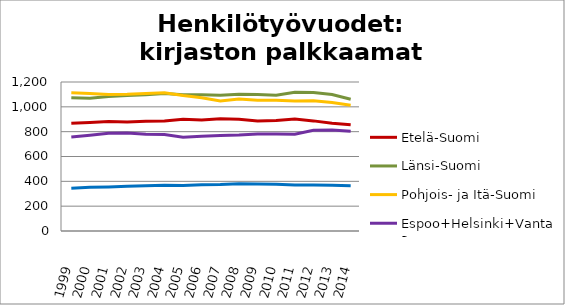
| Category | Etelä-Suomi | Länsi-Suomi | Pohjois- ja Itä-Suomi | Espoo+Helsinki+Vantaa | Muu Uusimaa |
|---|---|---|---|---|---|
| 1999.0 | 867.8 | 1074 | 1113.2 | 757.1 | 344.4 |
| 2000.0 | 874.6 | 1069.6 | 1108 | 771 | 351.6 |
| 2001.0 | 880.97 | 1082.95 | 1098.57 | 787 | 355.25 |
| 2002.0 | 877.57 | 1090.52 | 1100.49 | 789 | 359.84 |
| 2003.0 | 884.19 | 1096.31 | 1107.21 | 778.32 | 363.54 |
| 2004.0 | 886.59 | 1107.98 | 1113.94 | 778.04 | 367.47 |
| 2005.0 | 900.69 | 1097 | 1092.09 | 755 | 365.45 |
| 2006.0 | 894.54 | 1097.78 | 1073.83 | 764 | 371.78 |
| 2007.0 | 903.42 | 1092.97 | 1046.97 | 769 | 374.69 |
| 2008.0 | 899.14 | 1101.99 | 1062.27 | 773 | 381.31 |
| 2009.0 | 886.38 | 1098.53 | 1052.86 | 781.4 | 378.36 |
| 2010.0 | 890.83 | 1092.71 | 1052.37 | 780.8 | 375.71 |
| 2011.0 | 901.01 | 1117.81 | 1047.52 | 780 | 369.74 |
| 2012.0 | 886.85 | 1115.62 | 1049.91 | 811.5 | 369.84 |
| 2013.0 | 868.3 | 1098.62 | 1034.71 | 813.7 | 368.73 |
| 2014.0 | 855.39 | 1061.62 | 1012.01 | 803.2 | 364.4 |